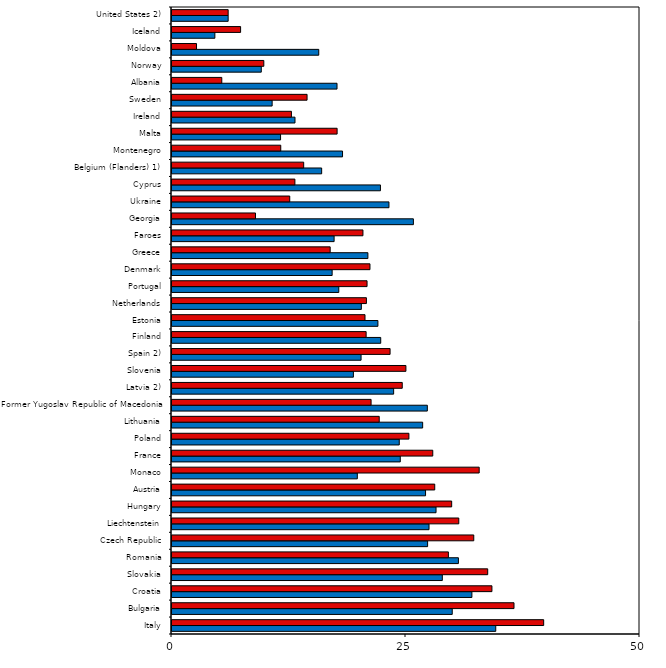
| Category | Boys | Girls |
|---|---|---|
| Italy | 34.59 | 39.71 |
| Bulgaria | 29.94 | 36.54 |
| Croatia | 32.04 | 34.18 |
| Slovakia | 28.88 | 33.73 |
| Romania | 30.6 | 29.53 |
| Czech Republic | 27.31 | 32.24 |
| Liechtenstein | 27.46 | 30.64 |
| Hungary | 28.21 | 29.88 |
| Austria | 27.09 | 28.07 |
| Monaco | 19.8 | 32.82 |
| France | 24.39 | 27.86 |
| Poland | 24.28 | 25.31 |
| Lithuania | 26.78 | 22.14 |
| Former Yugoslav Republic of Macedonia | 27.28 | 21.27 |
| Latvia 2) | 23.68 | 24.6 |
| Slovenia | 19.38 | 24.99 |
| Spain 2) | 20.2 | 23.3 |
| Finland | 22.3 | 20.74 |
| Estonia | 22 | 20.62 |
| Netherlands | 20.23 | 20.77 |
| Portugal | 17.82 | 20.84 |
| Denmark | 17.11 | 21.15 |
| Greece | 20.93 | 16.9 |
| Faroes | 17.32 | 20.4 |
| Georgia | 25.79 | 8.92 |
| Ukraine | 23.18 | 12.58 |
| Cyprus | 22.27 | 13.13 |
| Belgium (Flanders) 1) | 15.99 | 14.07 |
| Montenegro | 18.22 | 11.62 |
| Malta | 11.6 | 17.64 |
| Ireland | 13.14 | 12.76 |
| Sweden | 10.7 | 14.43 |
| Albania | 17.63 | 5.32 |
| Norway | 9.54 | 9.81 |
| Moldova | 15.68 | 2.62 |
| Iceland | 4.58 | 7.33 |
| United States 2) | 6 | 6 |